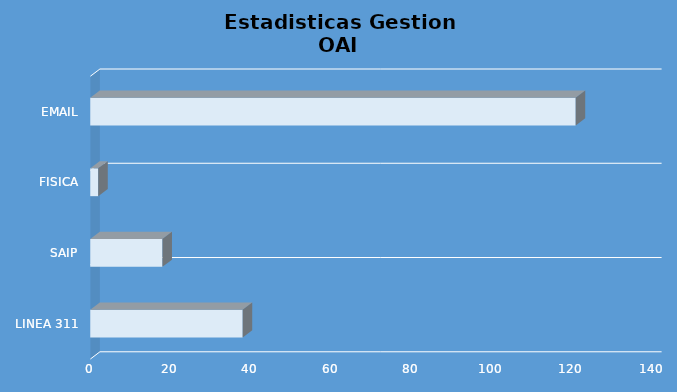
| Category | Series 0 |
|---|---|
| Linea 311 | 38 |
| SAIP | 18 |
| Fisica | 2 |
| Email | 121 |